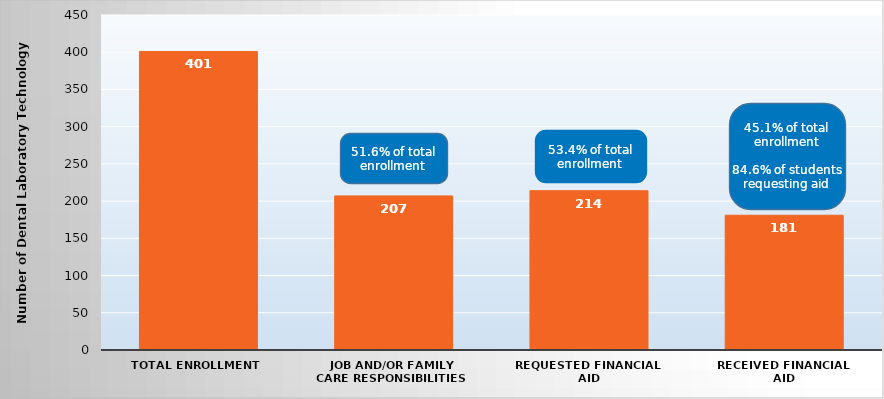
| Category | Series 0 |
|---|---|
| Total Enrollment | 401 |
| Job and/or Family Care Responsibilities | 207 |
| Requested Financial Aid | 214 |
| Received Financial Aid | 181 |